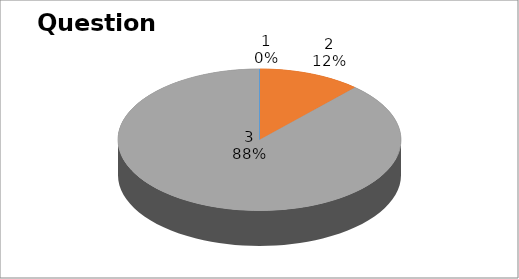
| Category | Series 0 |
|---|---|
| 0 | 0 |
| 1 | 2 |
| 2 | 15 |